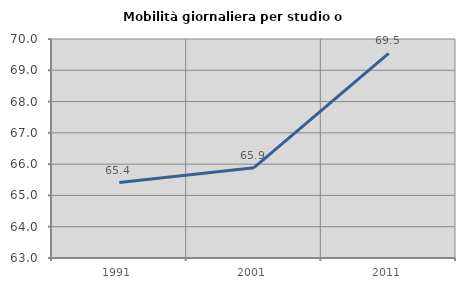
| Category | Mobilità giornaliera per studio o lavoro |
|---|---|
| 1991.0 | 65.411 |
| 2001.0 | 65.888 |
| 2011.0 | 69.543 |